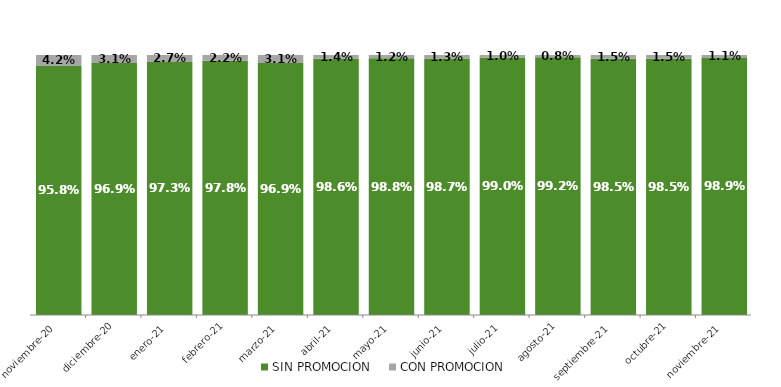
| Category | SIN PROMOCION   | CON PROMOCION   |
|---|---|---|
| 2020-11-01 | 0.958 | 0.042 |
| 2020-12-01 | 0.969 | 0.031 |
| 2021-01-01 | 0.973 | 0.027 |
| 2021-02-01 | 0.978 | 0.022 |
| 2021-03-01 | 0.969 | 0.031 |
| 2021-04-01 | 0.986 | 0.014 |
| 2021-05-01 | 0.988 | 0.012 |
| 2021-06-01 | 0.987 | 0.013 |
| 2021-07-01 | 0.99 | 0.01 |
| 2021-08-01 | 0.992 | 0.008 |
| 2021-09-01 | 0.985 | 0.015 |
| 2021-10-01 | 0.985 | 0.015 |
| 2021-11-01 | 0.989 | 0.011 |